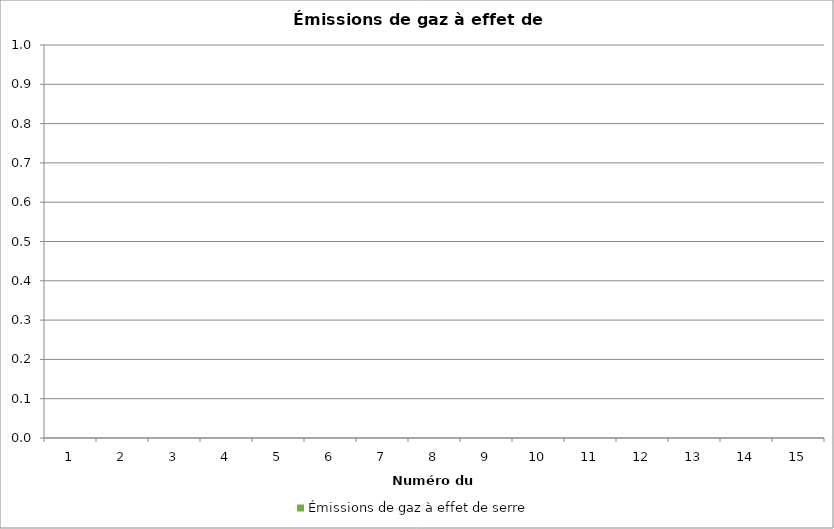
| Category | Émissions de gaz à effet de serre |
|---|---|
| 0 | 0 |
| 1 | 0 |
| 2 | 0 |
| 3 | 0 |
| 4 | 0 |
| 5 | 0 |
| 6 | 0 |
| 7 | 0 |
| 8 | 0 |
| 9 | 0 |
| 10 | 0 |
| 11 | 0 |
| 12 | 0 |
| 13 | 0 |
| 14 | 0 |